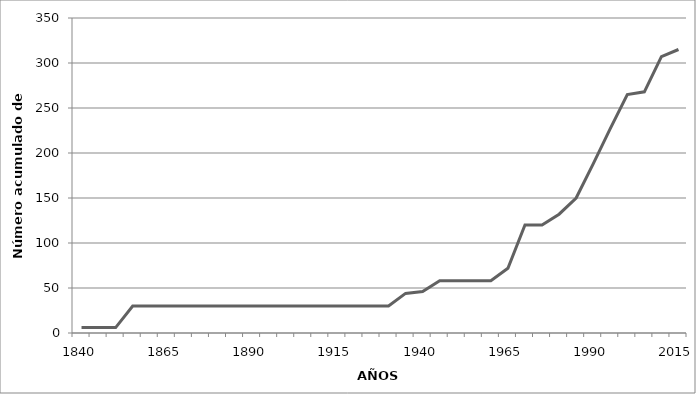
| Category | Años |
|---|---|
| 1840.0 | 6 |
| 1845.0 | 6 |
| 1850.0 | 6 |
| 1855.0 | 30 |
| 1860.0 | 30 |
| 1865.0 | 30 |
| 1870.0 | 30 |
| 1875.0 | 30 |
| 1880.0 | 30 |
| 1885.0 | 30 |
| 1890.0 | 30 |
| 1895.0 | 30 |
| 1900.0 | 30 |
| 1905.0 | 30 |
| 1910.0 | 30 |
| 1915.0 | 30 |
| 1920.0 | 30 |
| 1925.0 | 30 |
| 1930.0 | 30 |
| 1935.0 | 44 |
| 1940.0 | 46 |
| 1945.0 | 58 |
| 1950.0 | 58 |
| 1955.0 | 58 |
| 1960.0 | 58 |
| 1965.0 | 72 |
| 1970.0 | 120 |
| 1975.0 | 120 |
| 1980.0 | 132 |
| 1985.0 | 150 |
| 1990.0 | 188 |
| 1995.0 | 227 |
| 2000.0 | 265 |
| 2005.0 | 268 |
| 2010.0 | 307 |
| 2015.0 | 315 |